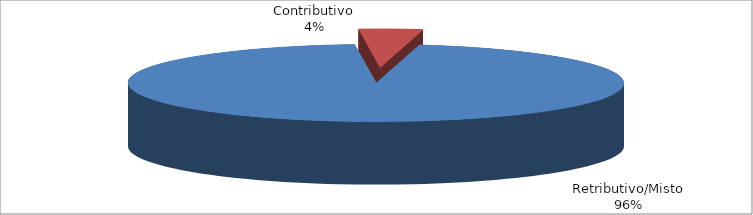
| Category | Decorrenti ANNO 2021 |
|---|---|
| Retributivo/Misto | 112565 |
| Contributivo | 4883 |